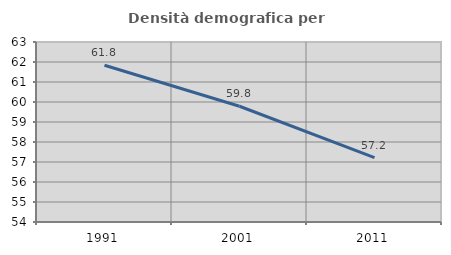
| Category | Densità demografica |
|---|---|
| 1991.0 | 61.837 |
| 2001.0 | 59.787 |
| 2011.0 | 57.214 |